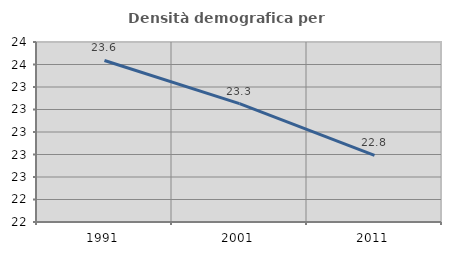
| Category | Densità demografica |
|---|---|
| 1991.0 | 23.636 |
| 2001.0 | 23.252 |
| 2011.0 | 22.792 |